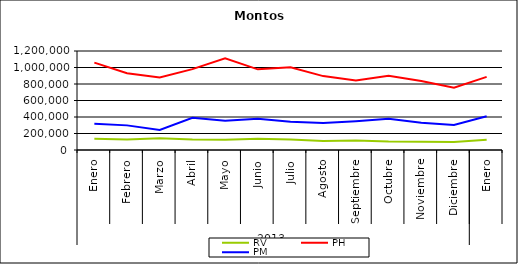
| Category | RV | PH | PM |
|---|---|---|---|
| 0 | 136808.804 | 1058774.967 | 316751.291 |
| 1 | 127193.421 | 930111.334 | 298480.292 |
| 2 | 142052.509 | 880100.908 | 242691.68 |
| 3 | 126637.277 | 980038.371 | 389833.89 |
| 4 | 123189.846 | 1112542.201 | 355777.139 |
| 5 | 135184.022 | 977877.296 | 379782.022 |
| 6 | 127790.361 | 1003315.643 | 342842.568 |
| 7 | 110532.346 | 895717.973 | 326616.455 |
| 8 | 114630.859 | 843607.598 | 348985.725 |
| 9 | 102262.08 | 901170.281 | 379642.157 |
| 10 | 99242.352 | 837424.505 | 330278.777 |
| 11 | 96243.301 | 754952.55 | 304473.582 |
| 12 | 124770.971 | 885857.327 | 408057.686 |